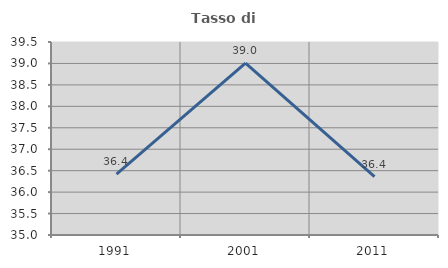
| Category | Tasso di occupazione   |
|---|---|
| 1991.0 | 36.419 |
| 2001.0 | 39.007 |
| 2011.0 | 36.364 |